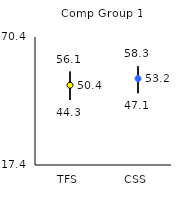
| Category | 25th | 75th | Mean |
|---|---|---|---|
| TFS | 44.3 | 56.1 | 50.43 |
| CSS | 47.1 | 58.3 | 53.19 |